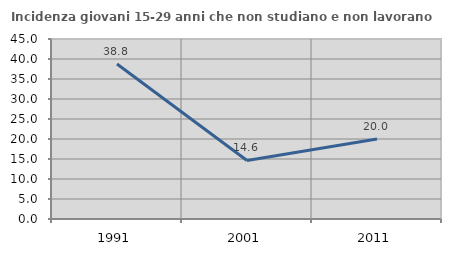
| Category | Incidenza giovani 15-29 anni che non studiano e non lavorano  |
|---|---|
| 1991.0 | 38.755 |
| 2001.0 | 14.634 |
| 2011.0 | 20 |